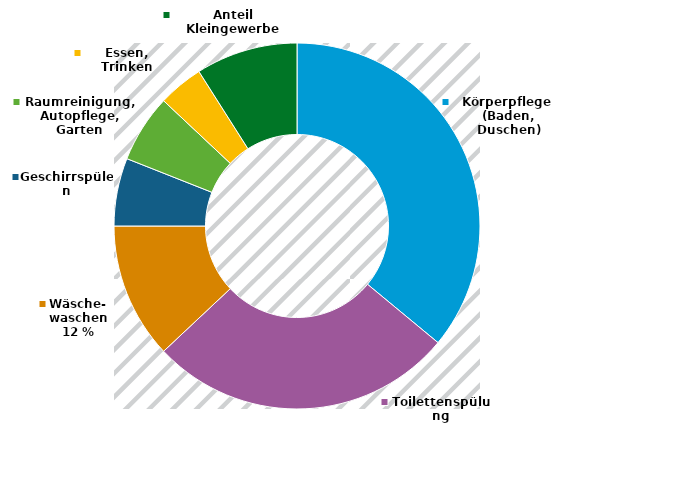
| Category | Körperpflege (Baden, Duschen) |
|---|---|
| Körperpflege (Baden, Duschen) | 0.36 |
| Toilettenspülung | 0.27 |
| Wäschewaschen | 0.12 |
| Geschirrspülen | 0.06 |
| Raumreinigung, Autopflege, Garten | 0.06 |
| Essen, Trinken | 0.04 |
| Anteil Kleingewerbe | 0.09 |